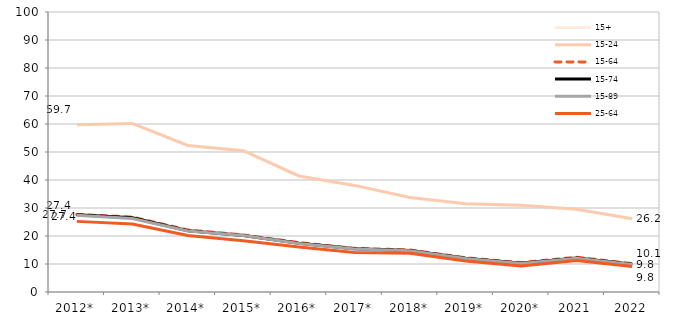
| Category | 15+ | 15-24 | 15-64 | 15-74 | 15-89 | 25-64 |
|---|---|---|---|---|---|---|
| 2012* | 27.449 | 59.722 | 27.714 | 27.58 | 27.449 | 25.223 |
| 2013* | 26.254 | 60.194 | 26.765 | 26.481 | 26.254 | 24.276 |
| 2014* | 21.789 | 52.343 | 22.165 | 21.912 | 21.789 | 20.154 |
| 2015* | 20.14 | 50.466 | 20.379 | 20.204 | 20.14 | 18.284 |
| 2016* | 17.321 | 41.445 | 17.662 | 17.445 | 17.321 | 16.054 |
| 2017* | 15.385 | 38.07 | 15.589 | 15.481 | 15.385 | 14.083 |
| 2018* | 14.745 | 33.723 | 15.019 | 14.831 | 14.745 | 13.838 |
| 2019* | 11.956 | 31.514 | 12.221 | 12.056 | 11.956 | 11.056 |
| 2020* | 10.188 | 31.024 | 10.476 | 10.266 | 10.188 | 9.311 |
| 2021 | 12.066 | 29.534 | 12.42 | 12.116 | 12.066 | 11.287 |
| 2022 | 9.845 | 26.163 | 10.136 | 9.879 | 9.845 | 9.086 |